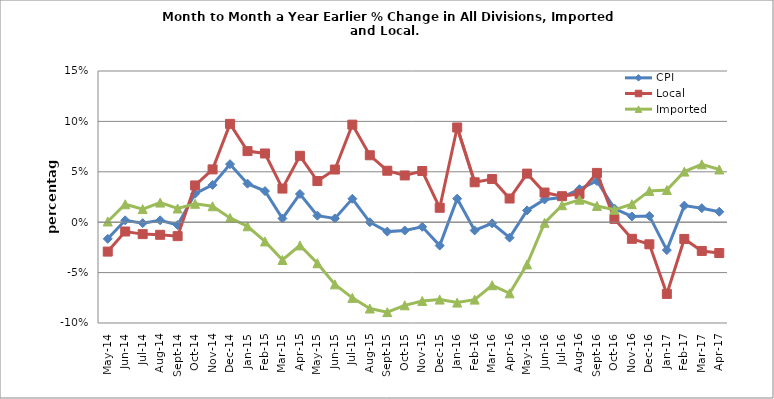
| Category | CPI | Local | Imported |
|---|---|---|---|
| 2014-05-02 | -0.016 | -0.029 | 0.001 |
| 2014-06-02 | 0.002 | -0.009 | 0.018 |
| 2014-07-02 | -0.001 | -0.012 | 0.013 |
| 2014-08-02 | 0.002 | -0.012 | 0.019 |
| 2014-09-02 | -0.003 | -0.014 | 0.014 |
| 2014-10-02 | 0.028 | 0.036 | 0.018 |
| 2014-11-02 | 0.037 | 0.052 | 0.016 |
| 2014-12-02 | 0.058 | 0.098 | 0.004 |
| 2015-01-02 | 0.038 | 0.071 | -0.004 |
| 2015-02-02 | 0.031 | 0.068 | -0.019 |
| 2015-03-02 | 0.004 | 0.033 | -0.037 |
| 2015-04-02 | 0.028 | 0.066 | -0.023 |
| 2015-05-01 | 0.007 | 0.041 | -0.041 |
| 2015-06-01 | 0.004 | 0.052 | -0.062 |
| 2015-07-01 | 0.023 | 0.097 | -0.075 |
| 2015-08-01 | 0 | 0.066 | -0.086 |
| 2015-09-01 | -0.009 | 0.051 | -0.089 |
| 2015-10-01 | -0.008 | 0.046 | -0.082 |
| 2015-11-01 | -0.005 | 0.051 | -0.078 |
| 2015-12-01 | -0.023 | 0.014 | -0.077 |
| 2016-01-01 | 0.023 | 0.094 | -0.08 |
| 2016-02-01 | -0.008 | 0.04 | -0.077 |
| 2016-03-01 | -0.001 | 0.043 | -0.063 |
| 2016-04-01 | -0.015 | 0.023 | -0.071 |
| 2016-05-01 | 0.012 | 0.048 | -0.042 |
| 2016-06-01 | 0.023 | 0.029 | -0.001 |
| 2016-07-01 | 0.025 | 0.026 | 0.017 |
| 2016-08-01 | 0.033 | 0.028 | 0.022 |
| 2016-09-01 | 0.041 | 0.049 | 0.016 |
| 2016-10-01 | 0.014 | 0.003 | 0.012 |
| 2016-11-01 | 0.006 | -0.016 | 0.018 |
| 2016-12-01 | 0.006 | -0.022 | 0.031 |
| 2017-01-01 | -0.028 | -0.071 | 0.032 |
| 2017-02-01 | 0.016 | -0.017 | 0.05 |
| 2017-03-01 | 0.014 | -0.029 | 0.057 |
| 2017-04-01 | 0.01 | -0.031 | 0.052 |